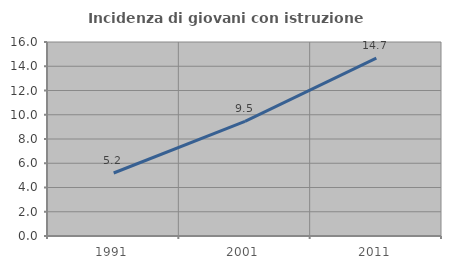
| Category | Incidenza di giovani con istruzione universitaria |
|---|---|
| 1991.0 | 5.195 |
| 2001.0 | 9.459 |
| 2011.0 | 14.667 |